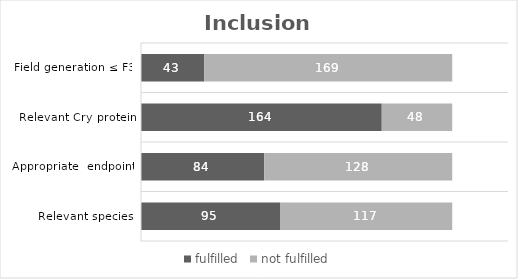
| Category | fulfilled | not fulfilled |
|---|---|---|
| Relevant species | 95 | 117 |
| Appropriate  endpoint | 84 | 128 |
| Relevant Cry protein | 164 | 48 |
|  Field generation ≤ F3 | 43 | 169 |